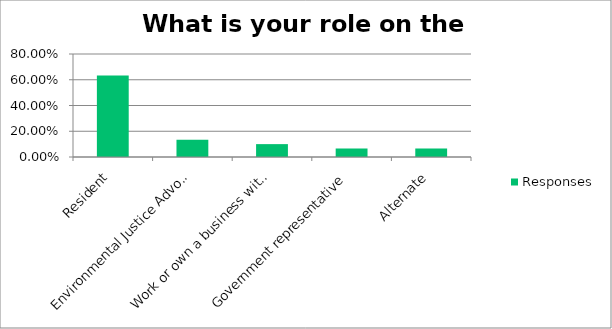
| Category | Responses |
|---|---|
| Resident | 0.633 |
| Environmental Justice Advocate | 0.133 |
| Work or own a business within the boundaries | 0.1 |
| Government representative | 0.067 |
| Alternate | 0.067 |